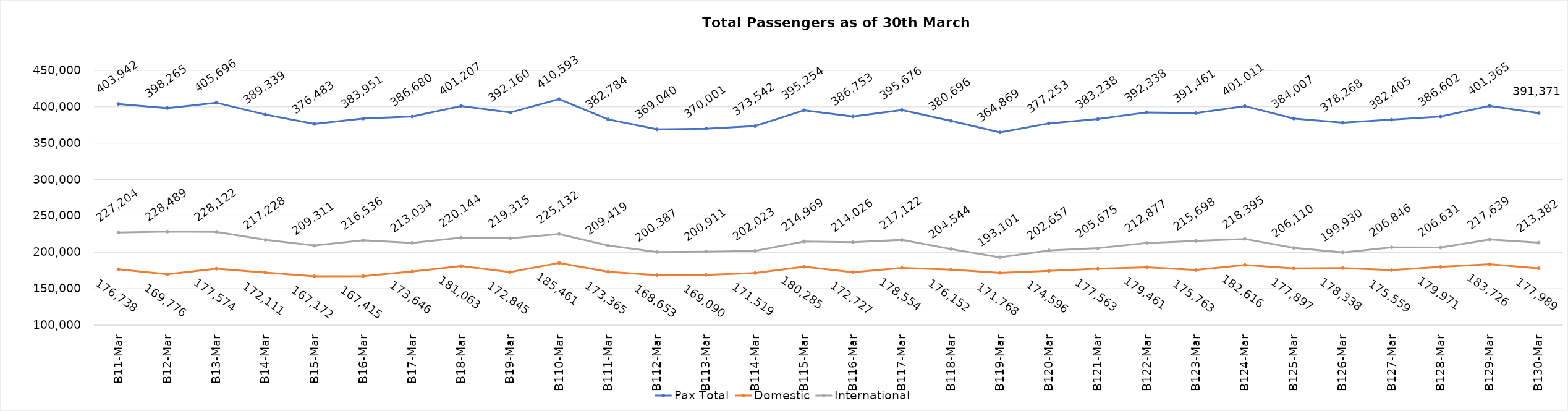
| Category | Pax Total | Domestic | International |
|---|---|---|---|
| 2024-03-01 | 403942 | 176738 | 227204 |
| 2024-03-02 | 398265 | 169776 | 228489 |
| 2024-03-03 | 405696 | 177574 | 228122 |
| 2024-03-04 | 389339 | 172111 | 217228 |
| 2024-03-05 | 376483 | 167172 | 209311 |
| 2024-03-06 | 383951 | 167415 | 216536 |
| 2024-03-07 | 386680 | 173646 | 213034 |
| 2024-03-08 | 401207 | 181063 | 220144 |
| 2024-03-09 | 392160 | 172845 | 219315 |
| 2024-03-10 | 410593 | 185461 | 225132 |
| 2024-03-11 | 382784 | 173365 | 209419 |
| 2024-03-12 | 369040 | 168653 | 200387 |
| 2024-03-13 | 370001 | 169090 | 200911 |
| 2024-03-14 | 373542 | 171519 | 202023 |
| 2024-03-15 | 395254 | 180285 | 214969 |
| 2024-03-16 | 386753 | 172727 | 214026 |
| 2024-03-17 | 395676 | 178554 | 217122 |
| 2024-03-18 | 380696 | 176152 | 204544 |
| 2024-03-19 | 364869 | 171768 | 193101 |
| 2024-03-20 | 377253 | 174596 | 202657 |
| 2024-03-21 | 383238 | 177563 | 205675 |
| 2024-03-22 | 392338 | 179461 | 212877 |
| 2024-03-23 | 391461 | 175763 | 215698 |
| 2024-03-24 | 401011 | 182616 | 218395 |
| 2024-03-25 | 384007 | 177897 | 206110 |
| 2024-03-26 | 378268 | 178338 | 199930 |
| 2024-03-27 | 382405 | 175559 | 206846 |
| 2024-03-28 | 386602 | 179971 | 206631 |
| 2024-03-29 | 401365 | 183726 | 217639 |
| 2024-03-30 | 391371 | 177989 | 213382 |